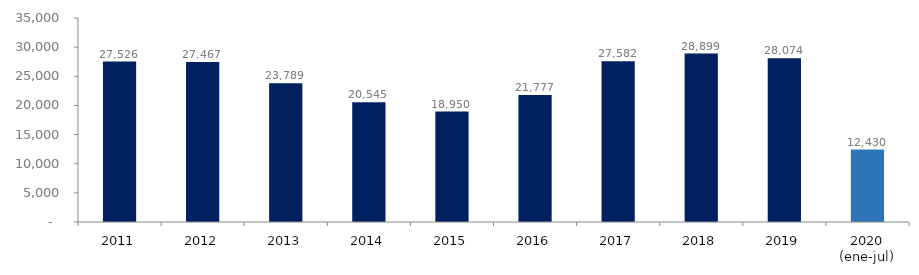
| Category | Series 1 |
|---|---|
| 2011 | 27525.675 |
| 2012 | 27466.673 |
| 2013 | 23789.445 |
| 2014 | 20545.414 |
| 2015 | 18950.14 |
| 2016 | 21776.636 |
| 2017 | 27581.607 |
| 2018 | 28898.658 |
| 2019 | 28073.793 |
| 2020 (ene-jul) | 12430.114 |